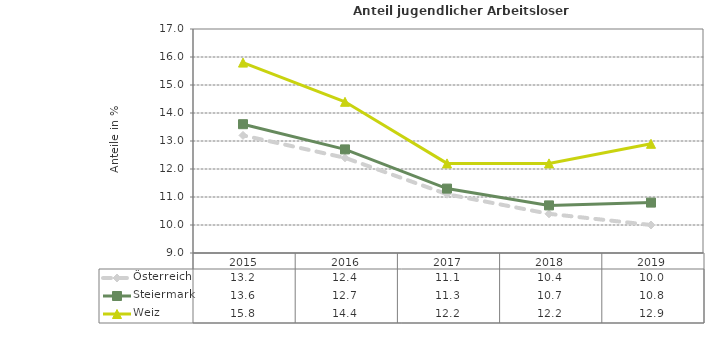
| Category | Österreich | Steiermark | Weiz |
|---|---|---|---|
| 2019.0 | 10 | 10.8 | 12.9 |
| 2018.0 | 10.4 | 10.7 | 12.2 |
| 2017.0 | 11.1 | 11.3 | 12.2 |
| 2016.0 | 12.4 | 12.7 | 14.4 |
| 2015.0 | 13.2 | 13.6 | 15.8 |